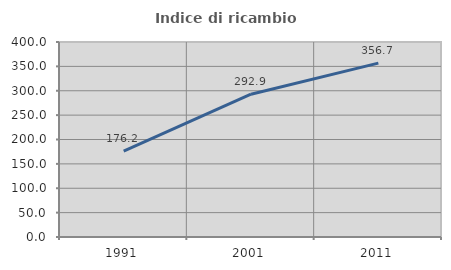
| Category | Indice di ricambio occupazionale  |
|---|---|
| 1991.0 | 176.241 |
| 2001.0 | 292.929 |
| 2011.0 | 356.701 |